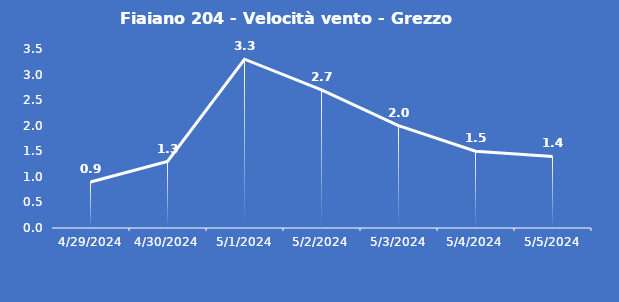
| Category | Fiaiano 204 - Velocità vento - Grezzo (m/s) |
|---|---|
| 4/29/24 | 0.9 |
| 4/30/24 | 1.3 |
| 5/1/24 | 3.3 |
| 5/2/24 | 2.7 |
| 5/3/24 | 2 |
| 5/4/24 | 1.5 |
| 5/5/24 | 1.4 |